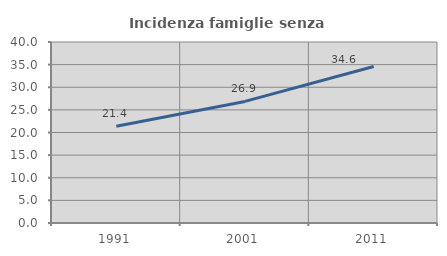
| Category | Incidenza famiglie senza nuclei |
|---|---|
| 1991.0 | 21.395 |
| 2001.0 | 26.871 |
| 2011.0 | 34.592 |